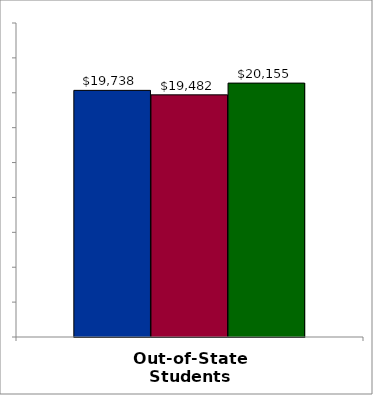
| Category | 50 states and D.C. | SREB states | State |
|---|---|---|---|
| Out-of-State Students | 19738 | 19481.5 | 20155 |